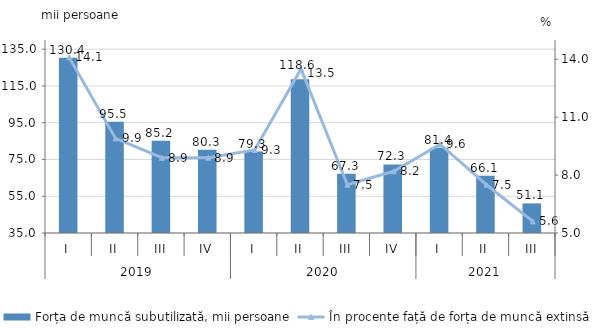
| Category | Forța de muncă subutilizată, mii persoane |
|---|---|
| 0 | 130.4 |
| 1 | 95.5 |
| 2 | 85.2 |
| 3 | 80.3 |
| 4 | 79.3 |
| 5 | 118.6 |
| 6 | 67.3 |
| 7 | 72.3 |
| 8 | 81.4 |
| 9 | 66.1 |
| 10 | 51.1 |